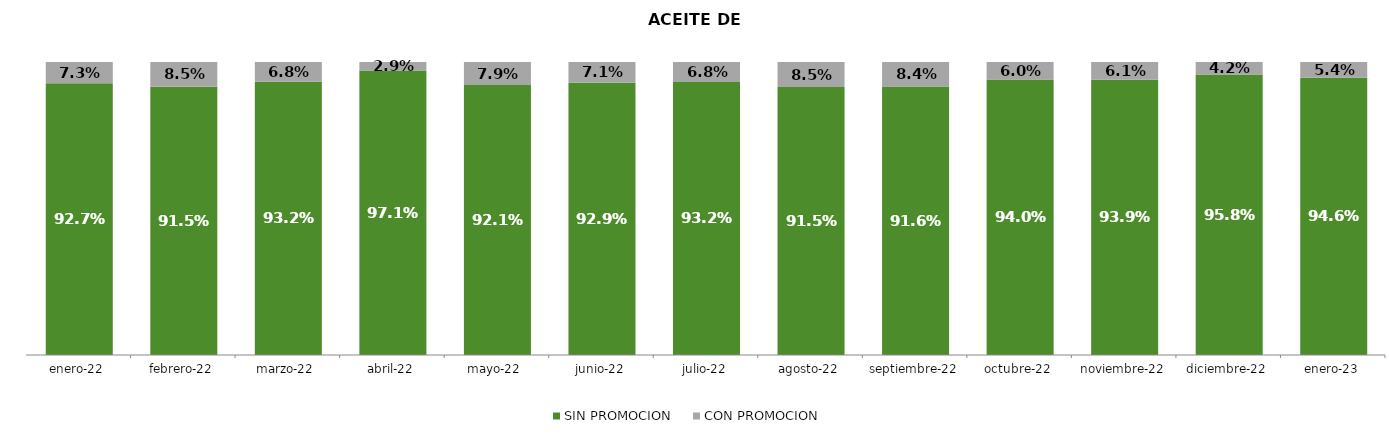
| Category | SIN PROMOCION   | CON PROMOCION   |
|---|---|---|
| 2022-01-01 | 0.927 | 0.073 |
| 2022-02-01 | 0.915 | 0.085 |
| 2022-03-01 | 0.932 | 0.068 |
| 2022-04-01 | 0.971 | 0.029 |
| 2022-05-01 | 0.921 | 0.079 |
| 2022-06-01 | 0.929 | 0.071 |
| 2022-07-01 | 0.932 | 0.068 |
| 2022-08-01 | 0.915 | 0.085 |
| 2022-09-01 | 0.916 | 0.084 |
| 2022-10-01 | 0.94 | 0.06 |
| 2022-11-01 | 0.939 | 0.061 |
| 2022-12-01 | 0.958 | 0.042 |
| 2023-01-01 | 0.946 | 0.054 |